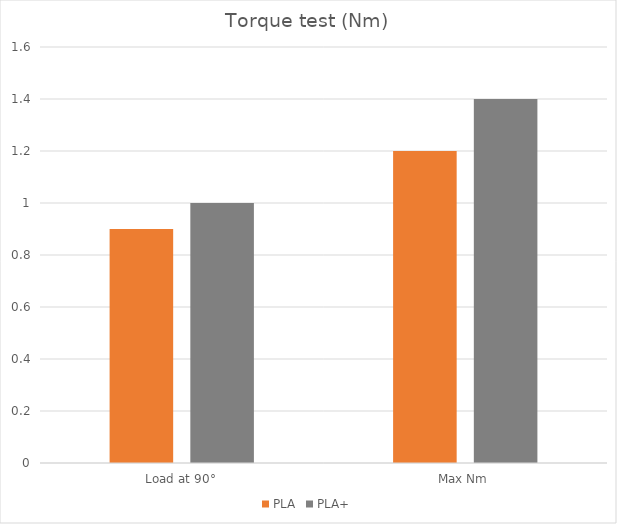
| Category | PLA | PLA+ |
|---|---|---|
| Load at 90° | 0.9 | 1 |
| Max Nm | 1.2 | 1.4 |